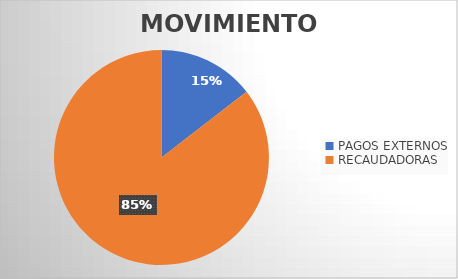
| Category | MOVIMIENTOS |
|---|---|
| PAGOS EXTERNOS | 5698 |
| RECAUDADORAS | 33526 |